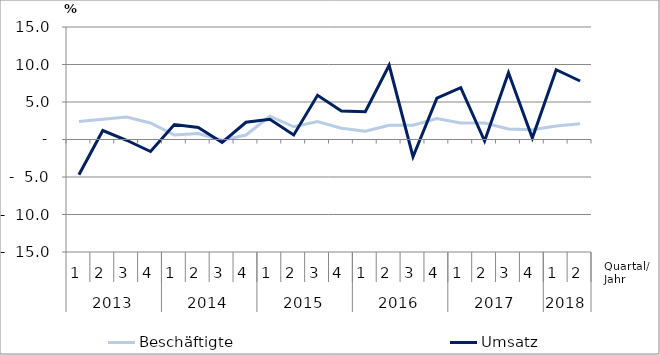
| Category | Beschäftigte | Umsatz |
|---|---|---|
| 0 | 2.4 | -4.7 |
| 1 | 2.7 | 1.2 |
| 2 | 3 | -0.1 |
| 3 | 2.2 | -1.6 |
| 4 | 0.6 | 2 |
| 5 | 0.8 | 1.6 |
| 6 | -0.1 | -0.4 |
| 7 | 0.6 | 2.3 |
| 8 | 3.1 | 2.7 |
| 9 | 1.7 | 0.6 |
| 10 | 2.4 | 5.9 |
| 11 | 1.5 | 3.8 |
| 12 | 1.1 | 3.7 |
| 13 | 1.9 | 9.9 |
| 14 | 1.9 | -2.3 |
| 15 | 2.8 | 5.5 |
| 16 | 2.2 | 6.9 |
| 17 | 2.2 | -0.2 |
| 18 | 1.4 | 8.9 |
| 19 | 1.3 | 0.2 |
| 20 | 1.8 | 9.3 |
| 21 | 2.1 | 7.8 |